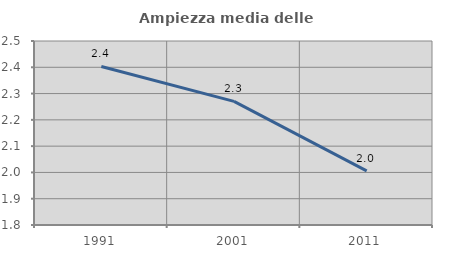
| Category | Ampiezza media delle famiglie |
|---|---|
| 1991.0 | 2.403 |
| 2001.0 | 2.27 |
| 2011.0 | 2.006 |